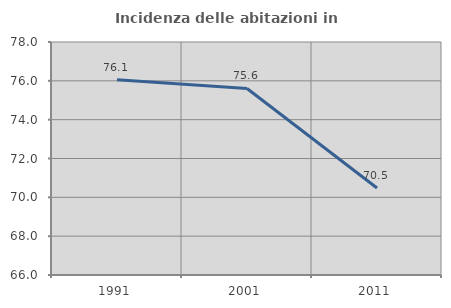
| Category | Incidenza delle abitazioni in proprietà  |
|---|---|
| 1991.0 | 76.059 |
| 2001.0 | 75.605 |
| 2011.0 | 70.48 |